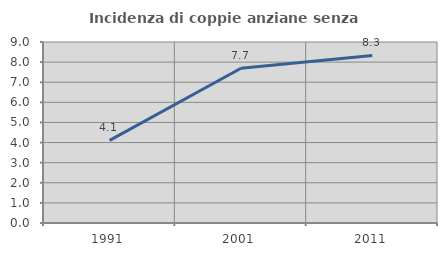
| Category | Incidenza di coppie anziane senza figli  |
|---|---|
| 1991.0 | 4.11 |
| 2001.0 | 7.692 |
| 2011.0 | 8.333 |